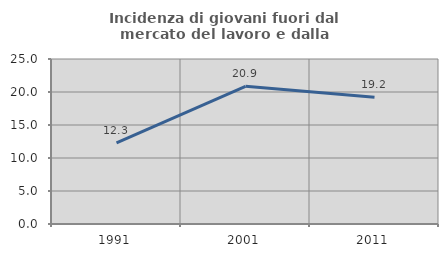
| Category | Incidenza di giovani fuori dal mercato del lavoro e dalla formazione  |
|---|---|
| 1991.0 | 12.295 |
| 2001.0 | 20.87 |
| 2011.0 | 19.192 |